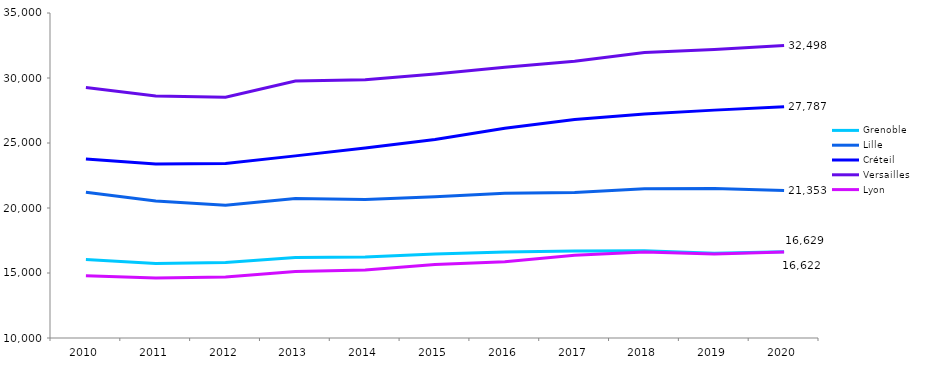
| Category | Grenoble | Lille | Créteil | Versailles | Lyon |
|---|---|---|---|---|---|
| 2010.0 | 16032 | 21217 | 23768 | 29266 | 14783 |
| 2011.0 | 15738 | 20534 | 23378 | 28617 | 14618 |
| 2012.0 | 15813 | 20218 | 23422 | 28522 | 14697 |
| 2013.0 | 16192 | 20736 | 24010 | 29774 | 15110 |
| 2014.0 | 16234 | 20663 | 24614 | 29858 | 15230 |
| 2015.0 | 16468 | 20858 | 25276 | 30304 | 15659 |
| 2016.0 | 16618 | 21142 | 26136 | 30818 | 15859 |
| 2017.0 | 16693 | 21197 | 26813 | 31285 | 16366 |
| 2018.0 | 16707 | 21488 | 27237 | 31960 | 16620 |
| 2019.0 | 16528 | 21498 | 27529 | 32193 | 16469 |
| 2020.0 | 16629 | 21353 | 27787 | 32498 | 16622 |